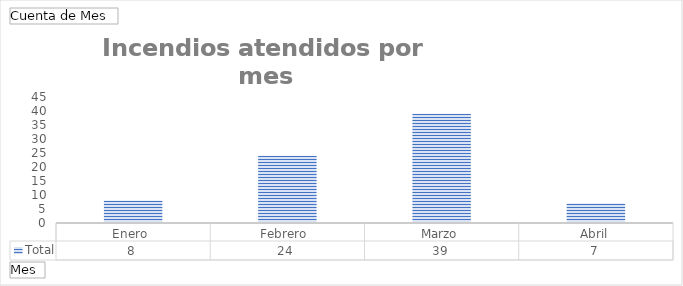
| Category | Total |
|---|---|
| Enero  | 8 |
| Febrero  | 24 |
| Marzo | 39 |
| Abril | 7 |